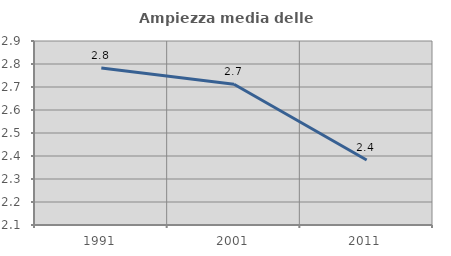
| Category | Ampiezza media delle famiglie |
|---|---|
| 1991.0 | 2.783 |
| 2001.0 | 2.712 |
| 2011.0 | 2.383 |